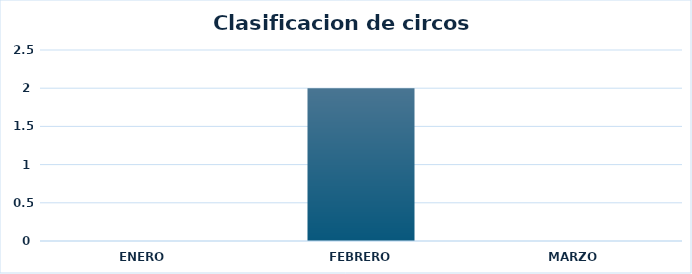
| Category | Diagrama de barras nota  |
|---|---|
| ENERO  | 0 |
| FEBRERO  | 2 |
| MARZO | 0 |